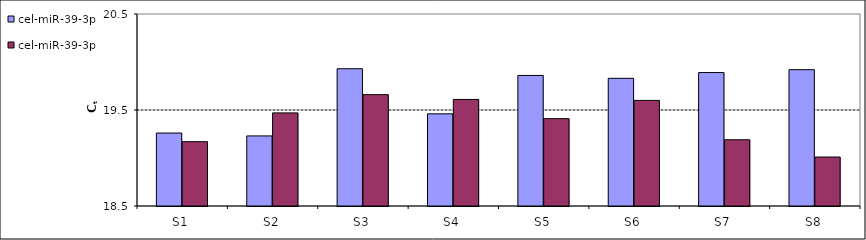
| Category | cel-miR-39-3p |
|---|---|
| S1 | 19.17 |
| S2 | 19.47 |
| S3 | 19.66 |
| S4 | 19.61 |
| S5 | 19.41 |
| S6 | 19.6 |
| S7 | 19.19 |
| S8 | 19.01 |